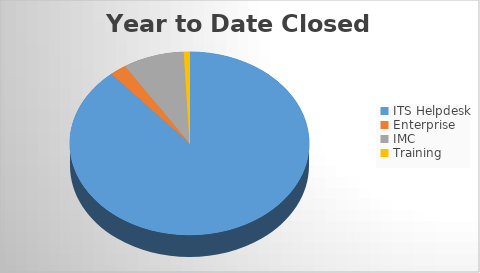
| Category | YTD Closed Tickets | 6M Opened |
|---|---|---|
| ITS Helpdesk | 2037 | 2030 |
| Enterprise | 52 | 45 |
| IMC | 190 | 192 |
| Training | 18 | 25 |